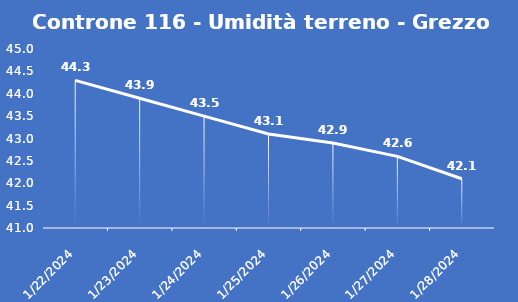
| Category | Controne 116 - Umidità terreno - Grezzo (%VWC) |
|---|---|
| 1/22/24 | 44.3 |
| 1/23/24 | 43.9 |
| 1/24/24 | 43.5 |
| 1/25/24 | 43.1 |
| 1/26/24 | 42.9 |
| 1/27/24 | 42.6 |
| 1/28/24 | 42.1 |